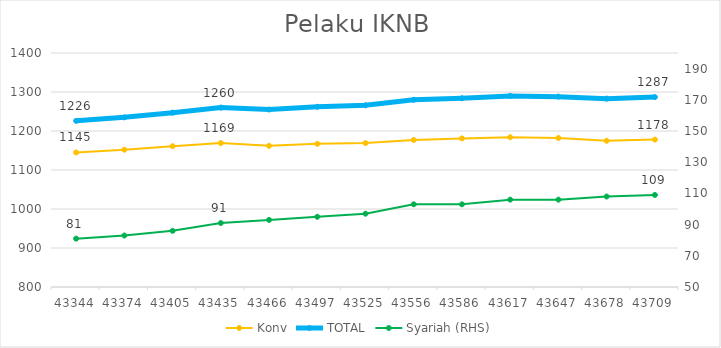
| Category | Konv | TOTAL |
|---|---|---|
| 2018-09-01 | 1145 | 1226 |
| 2018-10-01 | 1152 | 1235 |
| 2018-11-01 | 1161 | 1247 |
| 2018-12-01 | 1169 | 1260 |
| 2019-01-01 | 1162 | 1255 |
| 2019-02-01 | 1167 | 1262 |
| 2019-03-01 | 1169 | 1266 |
| 2019-04-01 | 1177 | 1280 |
| 2019-05-01 | 1181 | 1284 |
| 2019-06-01 | 1184 | 1290 |
| 2019-07-01 | 1182 | 1288 |
| 2019-08-01 | 1175 | 1283 |
| 2019-09-01 | 1178 | 1287 |